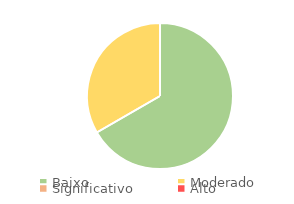
| Category | Series 0 |
|---|---|
| Baixo | 2 |
| Moderado | 1 |
| Significativo | 0 |
| Alto | 0 |